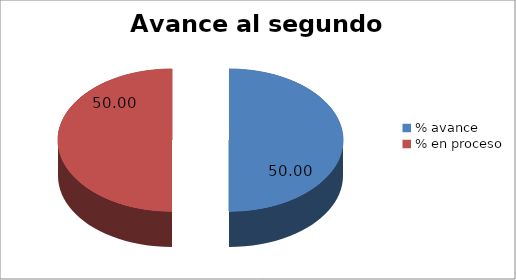
| Category | Series 0 |
|---|---|
| % avance | 50 |
| % en proceso | 50 |